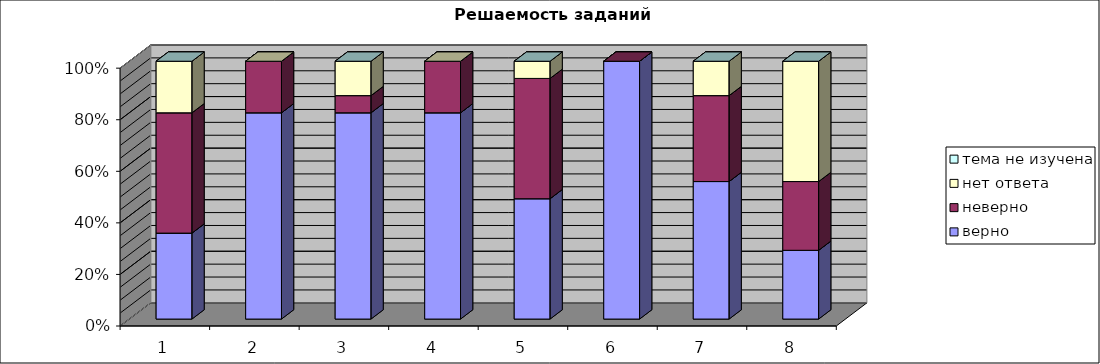
| Category | верно | неверно | нет ответа | тема не изучена |
|---|---|---|---|---|
| 1.0 | 0.333 | 0.467 | 0.2 | 0 |
| 2.0 | 0.8 | 0.2 | 0 | 0 |
| 3.0 | 0.8 | 0.067 | 0.133 | 0 |
| 4.0 | 0.8 | 0.2 | 0 | 0 |
| 5.0 | 0.467 | 0.467 | 0.067 | 0 |
| 6.0 | 1 | 0 | 0 | 0 |
| 7.0 | 0.533 | 0.333 | 0.133 | 0 |
| 8.0 | 0.267 | 0.267 | 0.467 | 0 |